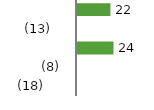
| Category | Variance |
|---|---|
| UK | 22 |
| US | -13 |
| Europe | 24 |
| Asia Pacific | -8 |
| MEA | -18 |